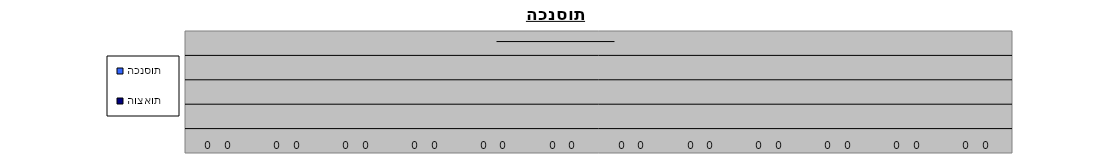
| Category | הכנסות | הוצאות  |
|---|---|---|
| 0 | 0 | 0 |
| 1 | 0 | 0 |
| 2 | 0 | 0 |
| 3 | 0 | 0 |
| 4 | 0 | 0 |
| 5 | 0 | 0 |
| 6 | 0 | 0 |
| 7 | 0 | 0 |
| 8 | 0 | 0 |
| 9 | 0 | 0 |
| 10 | 0 | 0 |
| 11 | 0 | 0 |